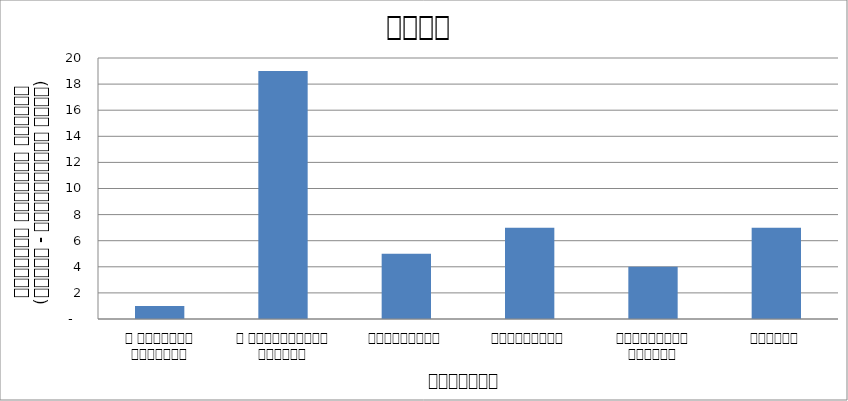
| Category | समाज |
|---|---|
| द हिमालयन टाइम्स् | 1 |
| द काठमाण्डौं पोस्ट् | 19 |
| रिपब्लिका | 5 |
| कान्तिपुर | 7 |
| अन्नपूर्ण पोस्ट् | 4 |
| नागरिक | 7 |